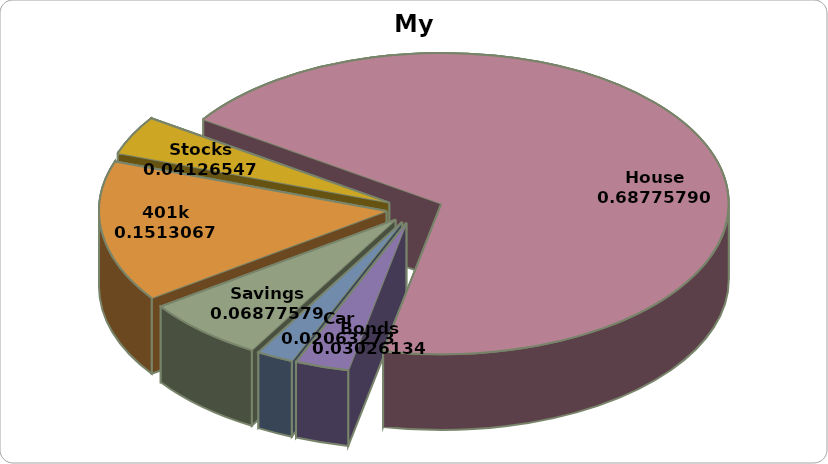
| Category | Amount |
|---|---|
| Savings | 25000 |
| 401k | 55000 |
| Stocks | 15000 |
| House | 250000 |
| Bonds | 11000 |
| Car | 7500 |